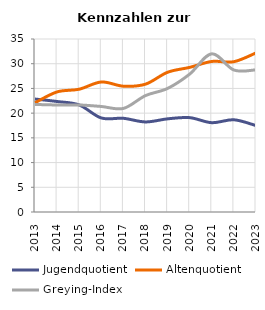
| Category | Jugendquotient | Altenquotient | Greying-Index |
|---|---|---|---|
| 2013.0 | 22.854 | 22.103 | 21.757 |
| 2014.0 | 22.354 | 24.298 | 21.654 |
| 2015.0 | 21.656 | 24.841 | 21.654 |
| 2016.0 | 19.022 | 26.304 | 21.348 |
| 2017.0 | 18.956 | 25.453 | 20.956 |
| 2018.0 | 18.22 | 25.864 | 23.551 |
| 2019.0 | 18.847 | 28.271 | 25 |
| 2020.0 | 19.09 | 29.26 | 27.9 |
| 2021.0 | 18.068 | 30.455 | 32 |
| 2022.0 | 18.66 | 30.41 | 28.72 |
| 2023.0 | 17.483 | 32.183 | 28.758 |